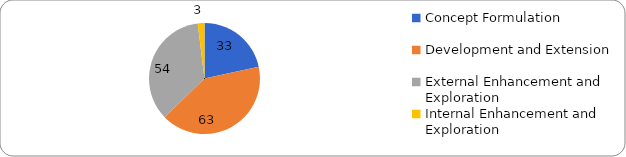
| Category | Grand Total |
|---|---|
| Concept Formulation | 33 |
| Development and Extension | 63 |
| External Enhancement and Exploration | 54 |
| Internal Enhancement and Exploration | 3 |